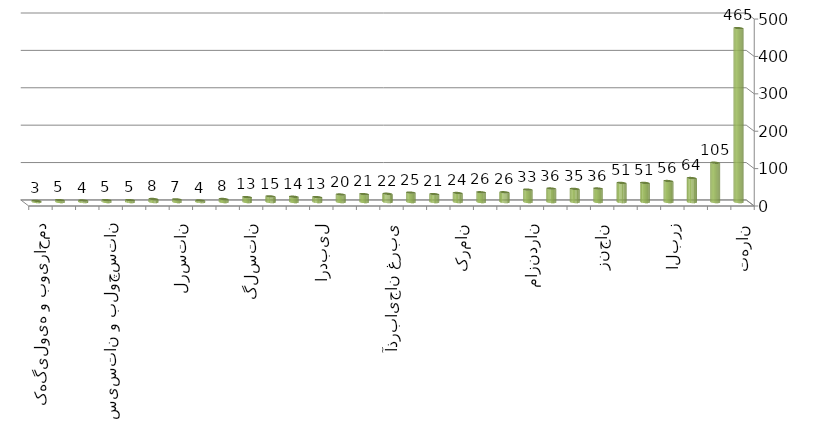
| Category | Series 0 |
|---|---|
| تهران | 465 |
| اصفهان | 105 |
| خراسان رضوی | 64 |
| البرز | 56 |
| هرمزگان | 51 |
| آذربایجان شرقی | 51 |
| زنجان | 36 |
| گیلان | 35 |
| فارس | 36 |
| مازندران | 33 |
| یزد | 26 |
| کرمانشاه | 26 |
| کرمان | 24 |
| قزوین | 21 |
| همدان | 25 |
| آذربایجان غربی | 22 |
| خوزستان | 21 |
| قم | 20 |
| اردبیل | 13 |
| سمنان | 14 |
| مرکزی | 15 |
| گلستان | 13 |
| خراسان شمالی | 8 |
| خراسان جنوبی | 4 |
| لرستان | 7 |
| کردستان | 8 |
| چهارمحال و بختیاری | 5 |
| سیستان و بلوچستان | 5 |
| ایلام | 4 |
| بوشهر | 5 |
| کهگیلویه و بویراحمد | 3 |